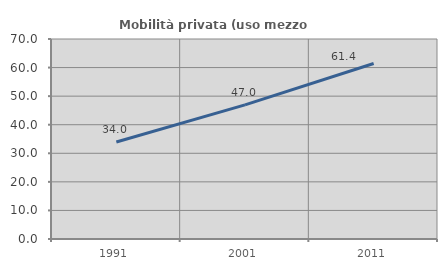
| Category | Mobilità privata (uso mezzo privato) |
|---|---|
| 1991.0 | 33.961 |
| 2001.0 | 46.958 |
| 2011.0 | 61.439 |